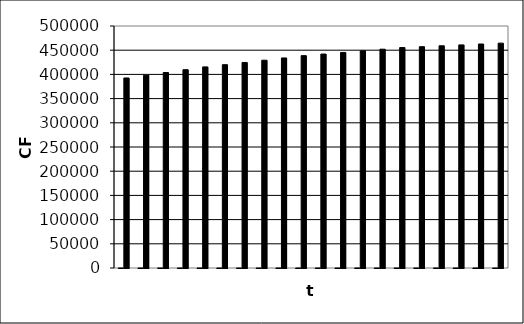
| Category | Series 0 | Series 1 |
|---|---|---|
| 0 | 1 | 392613.25 |
| 1 | 2 | 398226.609 |
| 2 | 3 | 403917.272 |
| 3 | 4 | 409686.227 |
| 4 | 5 | 415534.47 |
| 5 | 6 | 420085.039 |
| 6 | 7 | 424679.719 |
| 7 | 8 | 429318.783 |
| 8 | 9 | 434002.5 |
| 9 | 10 | 438731.138 |
| 10 | 11 | 442042.3 |
| 11 | 12 | 445368.19 |
| 12 | 13 | 448708.576 |
| 13 | 14 | 452063.216 |
| 14 | 15 | 455431.856 |
| 15 | 16 | 457284.556 |
| 16 | 17 | 459127.769 |
| 17 | 18 | 460960.943 |
| 18 | 19 | 462783.512 |
| 19 | 20 | 464594.894 |